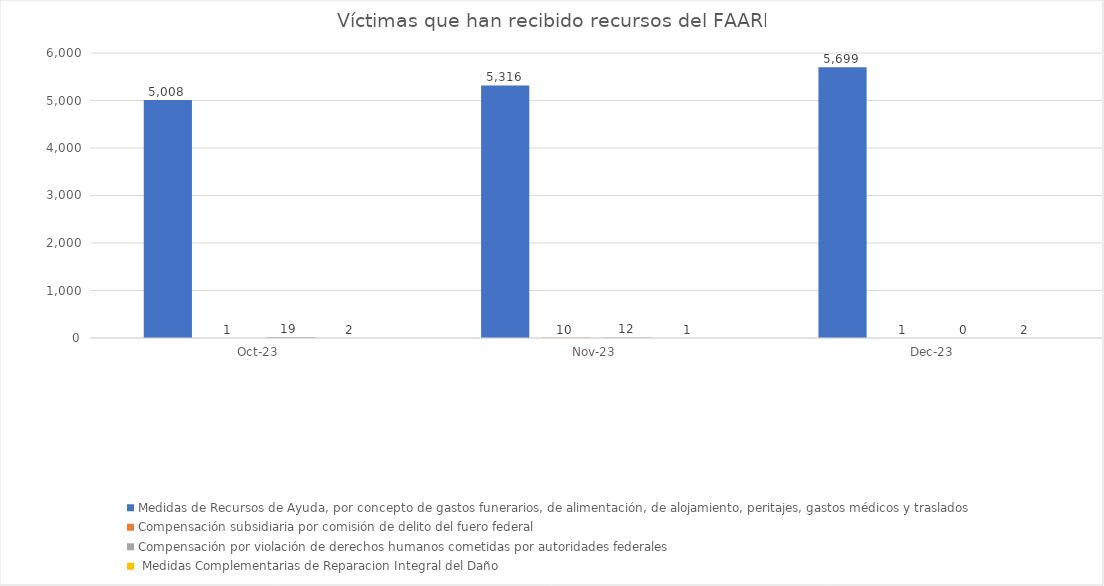
| Category | Medidas de Recursos de Ayuda, por concepto de gastos funerarios, de alimentación, de alojamiento, peritajes, gastos médicos y traslados | Compensación subsidiaria por comisión de delito del fuero federal | Compensación por violación de derechos humanos cometidas por autoridades federales |  Medidas Complementarias de Reparacion Integral del Daño |
|---|---|---|---|---|
| 2023-10-01 | 5008 | 1 | 19 | 2 |
| 2023-11-01 | 5316 | 10 | 12 | 1 |
| 2023-12-01 | 5699 | 1 | 0 | 2 |